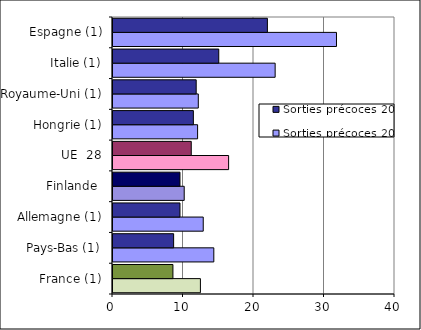
| Category | Sorties précoces 2003 | Sorties précoces 2014 |
|---|---|---|
| France (1) | 12.4 | 8.5 |
| Pays-Bas (1) | 14.3 | 8.6 |
| Allemagne (1) | 12.8 | 9.5 |
| Finlande  | 10.1 | 9.5 |
| UE  28 | 16.4 | 11.1 |
| Hongrie (1) | 12 | 11.4 |
| Royaume-Uni (1) | 12.1 | 11.8 |
| Italie (1) | 23 | 15 |
| Espagne (1) | 31.7 | 21.9 |